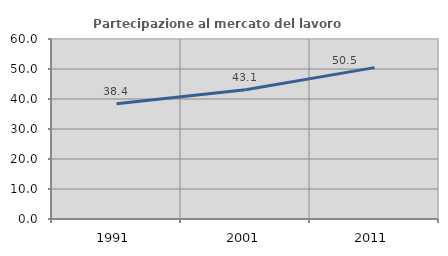
| Category | Partecipazione al mercato del lavoro  femminile |
|---|---|
| 1991.0 | 38.414 |
| 2001.0 | 43.102 |
| 2011.0 | 50.456 |